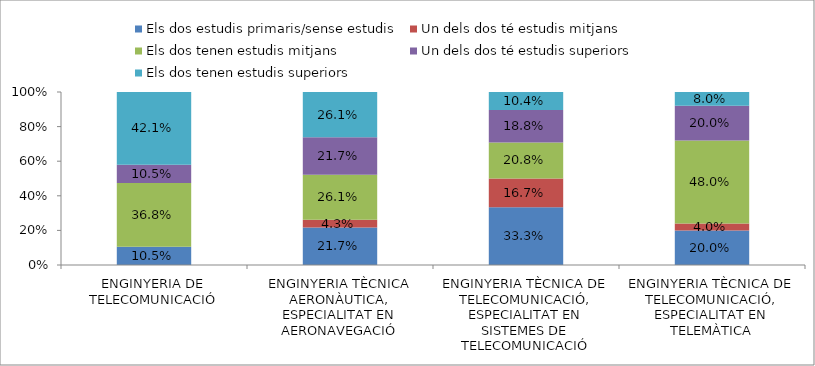
| Category | Els dos estudis primaris/sense estudis | Un dels dos té estudis mitjans | Els dos tenen estudis mitjans | Un dels dos té estudis superiors | Els dos tenen estudis superiors |
|---|---|---|---|---|---|
| ENGINYERIA DE TELECOMUNICACIÓ | 0.105 | 0 | 0.368 | 0.105 | 0.421 |
| ENGINYERIA TÈCNICA AERONÀUTICA, ESPECIALITAT EN AERONAVEGACIÓ | 0.217 | 0.043 | 0.261 | 0.217 | 0.261 |
| ENGINYERIA TÈCNICA DE TELECOMUNICACIÓ, ESPECIALITAT EN SISTEMES DE TELECOMUNICACIÓ | 0.333 | 0.167 | 0.208 | 0.188 | 0.104 |
| ENGINYERIA TÈCNICA DE TELECOMUNICACIÓ, ESPECIALITAT EN TELEMÀTICA | 0.2 | 0.04 | 0.48 | 0.2 | 0.08 |